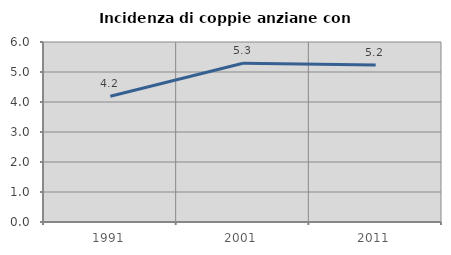
| Category | Incidenza di coppie anziane con figli |
|---|---|
| 1991.0 | 4.192 |
| 2001.0 | 5.294 |
| 2011.0 | 5.233 |